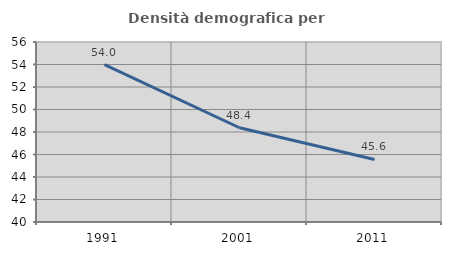
| Category | Densità demografica |
|---|---|
| 1991.0 | 53.996 |
| 2001.0 | 48.379 |
| 2011.0 | 45.56 |